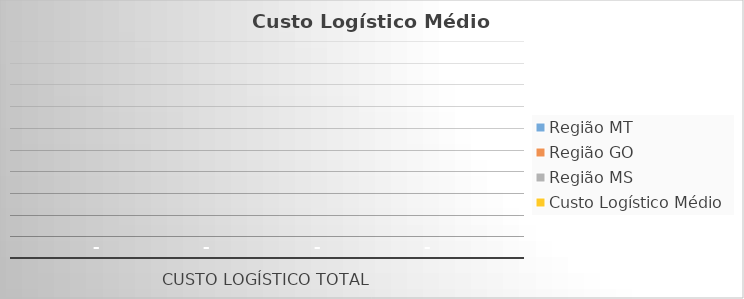
| Category | Região MT | Região GO | Região MS | Custo Logístico Médio |
|---|---|---|---|---|
| Custo Logístico Total | 0 | 0 | 0 | 0 |